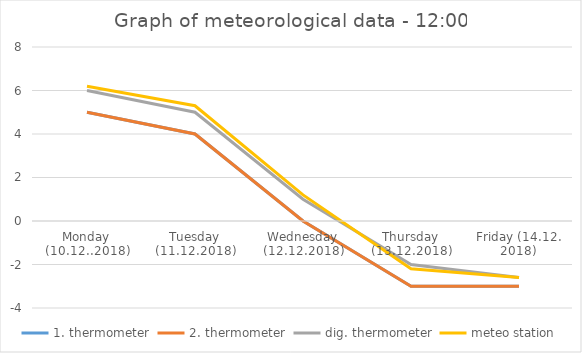
| Category | 1. thermometer | 2. thermometer | dig. thermometer | meteo station |
|---|---|---|---|---|
| Monday (10.12..2018) | 5 | 5 | 6 | 6.2 |
| Tuesday (11.12.2018) | 4 | 4 | 5 | 5.3 |
| Wednesday (12.12.2018) | 0 | 0 | 1 | 1.2 |
| Thursday (13.12.2018) | -3 | -3 | -2 | -2.2 |
| Friday (14.12. 2018) | -3 | -3 | -2.6 | -2.6 |